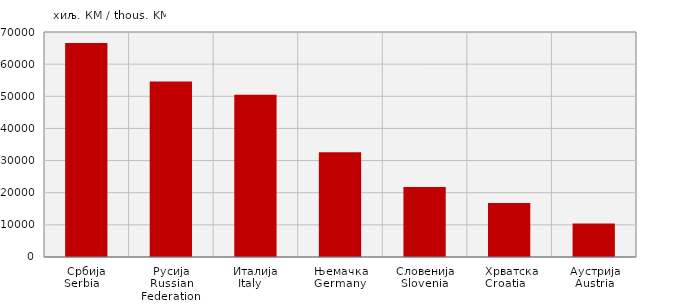
| Category | Увоз
Import |
|---|---|
| Србија
Serbia    | 66575.76 |
| Русија
Russian Federation  | 54602.842 |
| Италија
Italy    | 50447.339 |
| Њемачка
Germany  | 32591.382 |
| Словенија
Slovenia  | 21797.604 |
|  Хрватска
Croatia    | 16792.781 |
| Аустрија
Austria | 10449.375 |